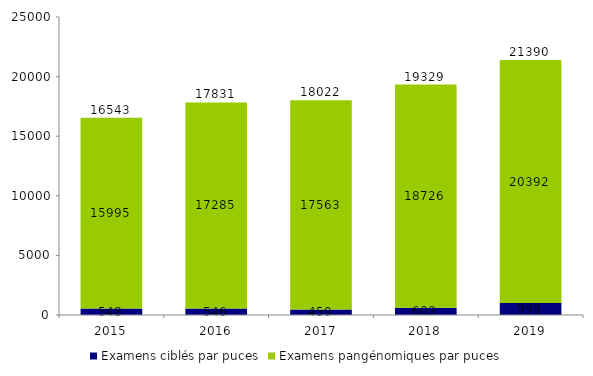
| Category | Examens ciblés par puces | Examens pangénomiques par puces | Total |
|---|---|---|---|
| 2015.0 | 548 | 15995 | 16543 |
| 2016.0 | 546 | 17285 | 17831 |
| 2017.0 | 459 | 17563 | 18022 |
| 2018.0 | 603 | 18726 | 19329 |
| 2019.0 | 998 | 20392 | 21390 |